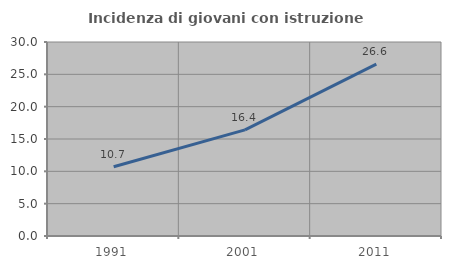
| Category | Incidenza di giovani con istruzione universitaria |
|---|---|
| 1991.0 | 10.71 |
| 2001.0 | 16.419 |
| 2011.0 | 26.581 |